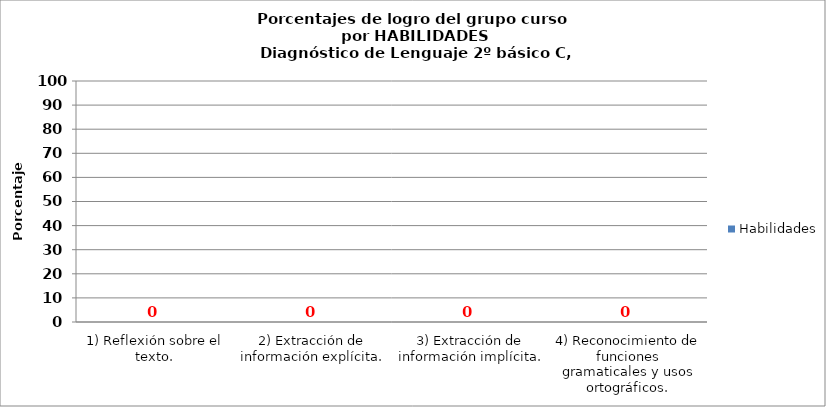
| Category | Habilidades |
|---|---|
| 1) Reflexión sobre el texto. | 0 |
| 2) Extracción de información explícita. | 0 |
| 3) Extracción de información implícita. | 0 |
| 4) Reconocimiento de funciones gramaticales y usos ortográficos. | 0 |